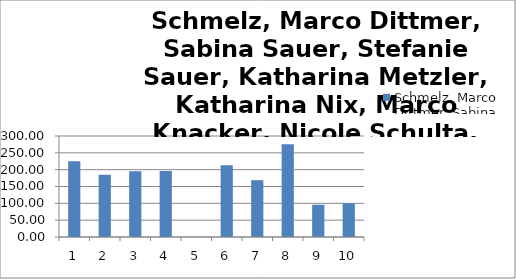
| Category | Schmelz, Marco Dittmer, Sabina Sauer, Stefanie Sauer, Katharina Metzler, Katharina Nix, Marco Knacker, Nicole Schulta, Martin Löffert, Sina Hohmann, Patricia |
|---|---|
| 0 | 225.06 |
| 1 | 184.91 |
| 2 | 195.03 |
| 3 | 196.18 |
| 4 | 0 |
| 5 | 213.27 |
| 6 | 168.75 |
| 7 | 275.65 |
| 8 | 95.79 |
| 9 | 100.21 |